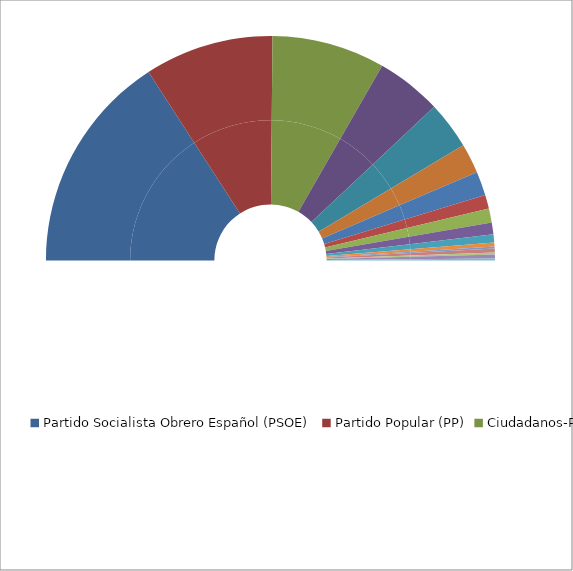
| Category | Series 0 | Series 1 |
|---|---|---|
| Partido Socialista Obrero Español (PSOE) | 111 | 31.714 |
| Partido Popular (PP) | 65 | 18.571 |
| Ciudadanos-Partido de la Ciudadanía (C's) | 57 | 16.286 |
| Unidos Podemos (PODEMOS-IU-EQUO) | 33 | 9.429 |
| VOX | 24 | 6.857 |
| Esquerra Republicana de Catalunya-Sobiranistes (ERC-SOBIRANISTES) | 15 | 4.286 |
| Partit dels Socialistes de Catalunya (PSC-PSOE) (PSC) | 12 | 3.429 |
| En Comú Podem-Guanyem el Canvi (ECP-GUANYEM EL CANVI) | 7 | 2 |
| Junts per Catalunya-Junts (JxCAT-JUNTS) | 7 | 2 |
| Euzko Alderdi Jetzalea-Partido Nacionalista Vasco (EAJ-PNV) | 6 | 1.714 |
| Euskal Herria Bildu (EH Bildu) | 4 | 1.143 |
| En Común-Unidas Podemos (PODEMOS-EU-MAREAS EN COMÚN-EQUO) | 2 | 0.571 |
| Compromís: Bloc-Iniciativa-Verdsequo (COMPROMÍS 2019) | 1 | 0.286 |
| Coalición Canaria-Partido Nacionalista Canario (CCa-PNC) | 2 | 0.571 |
| Partido Popular-Foro (PP-FORO) | 1 | 0.286 |
| Navarra Suma (NA+) | 2 | 0.571 |
| Partido Regionalista de Cantabria (PRC) | 1 | 0.286 |